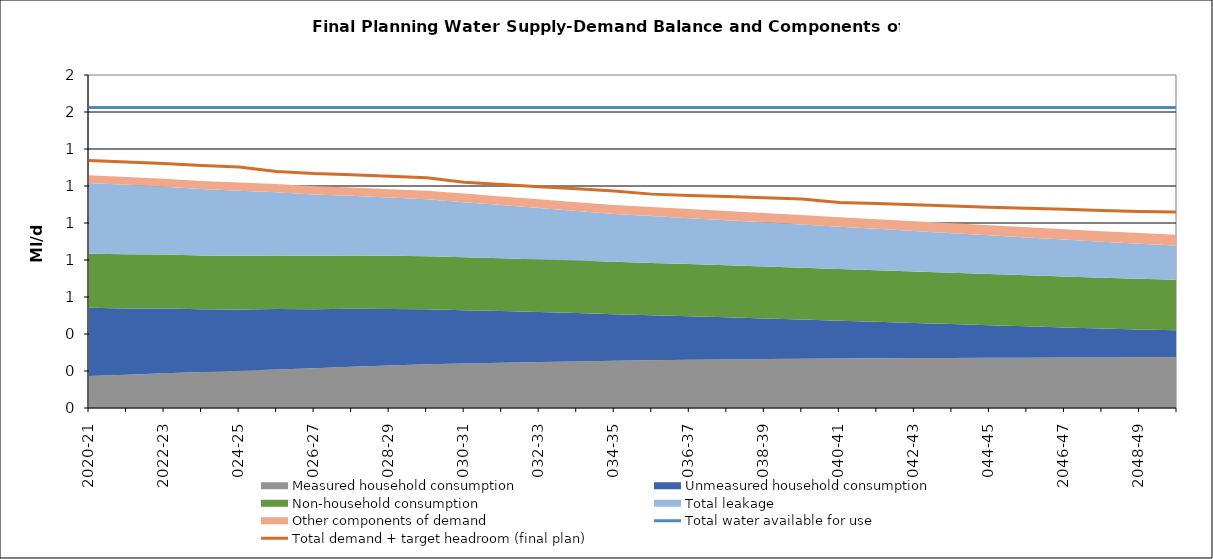
| Category | Total water available for use | Total demand + target headroom (final plan) |
|---|---|---|
| 2020-21 | 1.625 | 1.338 |
| 2021-22 | 1.625 | 1.329 |
| 2022-23 | 1.625 | 1.322 |
| 2023-24 | 1.625 | 1.311 |
| 2024-25 | 1.625 | 1.302 |
| 2025-26 | 1.625 | 1.278 |
| 2026-27 | 1.625 | 1.267 |
| 2027-28 | 1.625 | 1.261 |
| 2028-29 | 1.625 | 1.253 |
| 2029-30 | 1.625 | 1.245 |
| 2030-31 | 1.625 | 1.22 |
| 2031-32 | 1.625 | 1.208 |
| 2032-33 | 1.625 | 1.196 |
| 2033-34 | 1.625 | 1.185 |
| 2034-35 | 1.625 | 1.173 |
| 2035-36 | 1.625 | 1.156 |
| 2036-37 | 1.625 | 1.149 |
| 2037-38 | 1.625 | 1.144 |
| 2038-39 | 1.625 | 1.137 |
| 2039-40 | 1.625 | 1.13 |
| 2040-41 | 1.625 | 1.111 |
| 2041-42 | 1.625 | 1.105 |
| 2042-43 | 1.625 | 1.099 |
| 2043-44 | 1.625 | 1.092 |
| 2044-45 | 1.625 | 1.085 |
| 2045-46 | 1.625 | 1.08 |
| 2046-47 | 1.625 | 1.074 |
| 2047-48 | 1.625 | 1.068 |
| 2048-49 | 1.625 | 1.063 |
| 2049-50 | 1.625 | 1.059 |